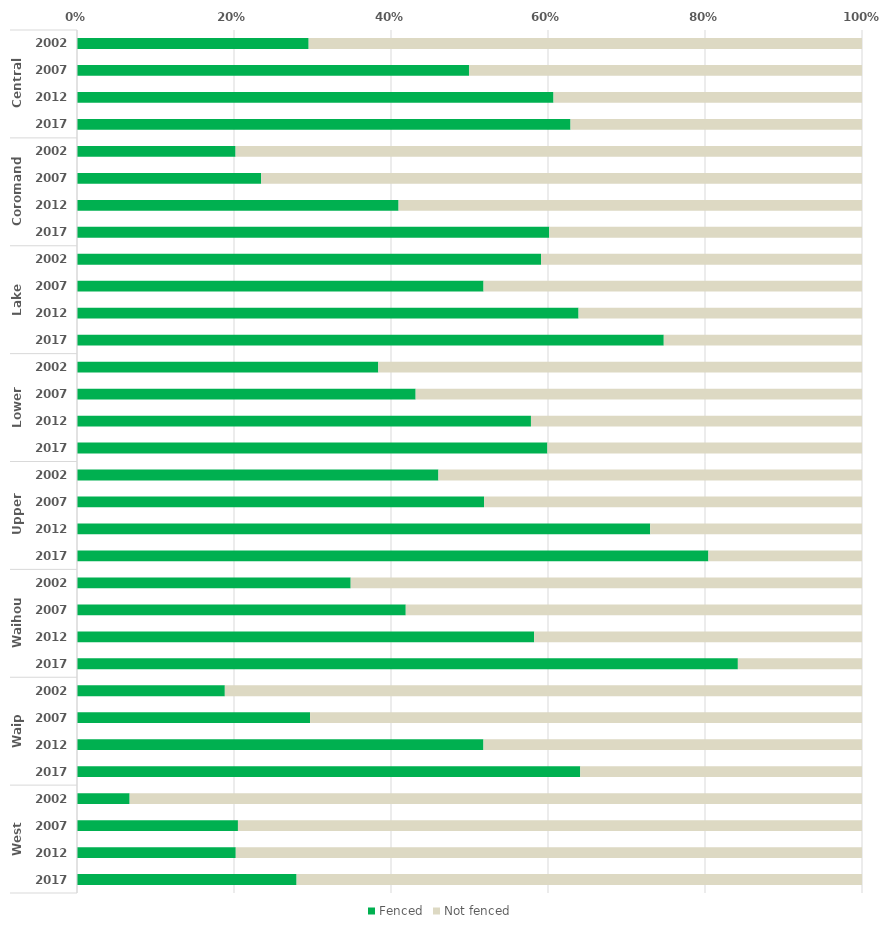
| Category | Fenced | Not fenced |
|---|---|---|
| 0 | 29.512 | 70.488 |
| 1 | 49.935 | 50.065 |
| 2 | 60.702 | 39.298 |
| 3 | 62.869 | 37.131 |
| 4 | 20.201 | 79.799 |
| 5 | 23.463 | 76.537 |
| 6 | 40.966 | 59.034 |
| 7 | 60.156 | 39.844 |
| 8 | 59.123 | 40.877 |
| 9 | 51.79 | 48.21 |
| 10 | 63.893 | 36.107 |
| 11 | 74.748 | 25.252 |
| 12 | 38.382 | 61.618 |
| 13 | 43.141 | 56.859 |
| 14 | 57.829 | 42.171 |
| 15 | 59.926 | 40.074 |
| 16 | 46.041 | 53.959 |
| 17 | 51.859 | 48.141 |
| 18 | 73.015 | 26.985 |
| 19 | 80.435 | 19.565 |
| 20 | 34.865 | 65.135 |
| 21 | 41.88 | 58.12 |
| 22 | 58.239 | 41.761 |
| 23 | 84.186 | 15.814 |
| 24 | 18.831 | 81.169 |
| 25 | 29.688 | 70.312 |
| 26 | 51.78 | 48.22 |
| 27 | 64.11 | 35.89 |
| 28 | 6.706 | 93.294 |
| 29 | 20.502 | 79.498 |
| 30 | 20.224 | 79.776 |
| 31 | 27.974 | 72.026 |